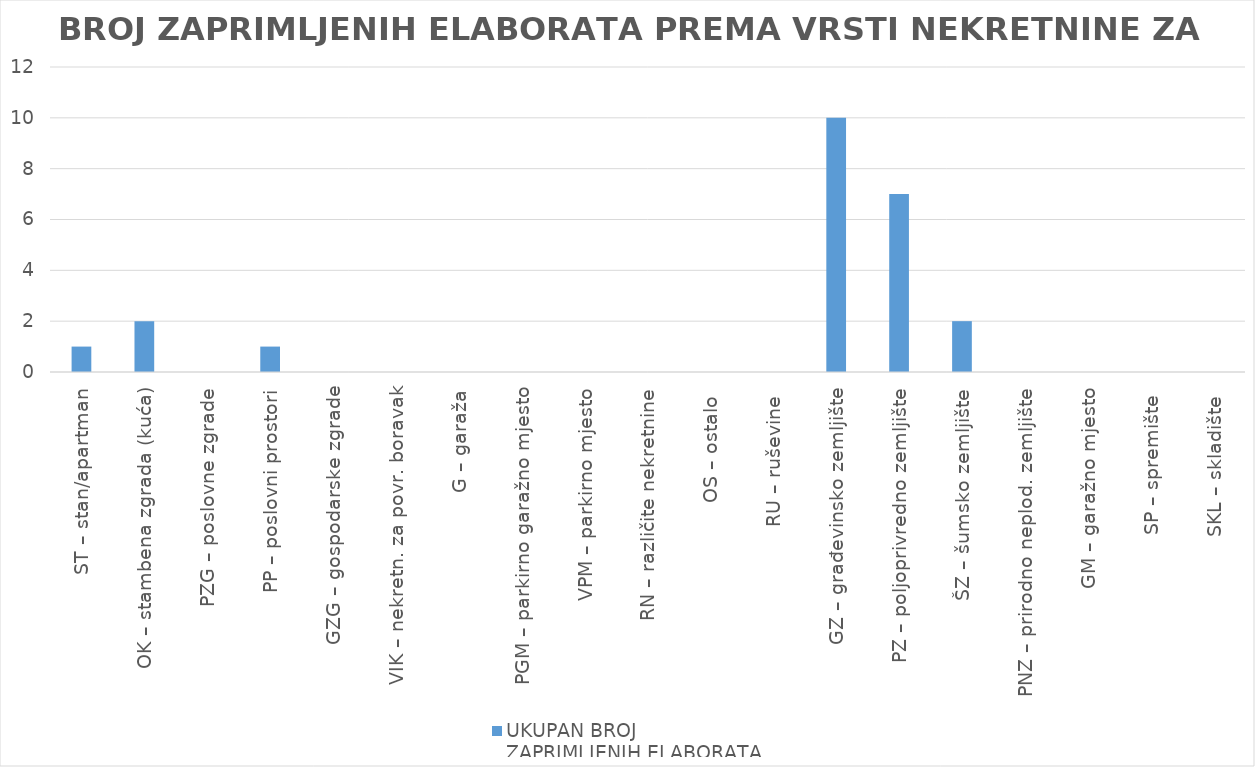
| Category | UKUPAN BROJ 
ZAPRIMLJENIH ELABORATA |
|---|---|
| ST – stan/apartman | 1 |
| OK – stambena zgrada (kuća) | 2 |
| PZG – poslovne zgrade | 0 |
| PP – poslovni prostori | 1 |
| GZG – gospodarske zgrade | 0 |
| VIK – nekretn. za povr. boravak | 0 |
| G – garaža | 0 |
| PGM – parkirno garažno mjesto | 0 |
| VPM – parkirno mjesto | 0 |
| RN – različite nekretnine | 0 |
| OS – ostalo  | 0 |
| RU – ruševine  | 0 |
| GZ – građevinsko zemljište | 10 |
| PZ – poljoprivredno zemljište | 7 |
| ŠZ – šumsko zemljište | 2 |
| PNZ – prirodno neplod. zemljište | 0 |
| GM – garažno mjesto | 0 |
| SP – spremište  | 0 |
| SKL – skladište  | 0 |